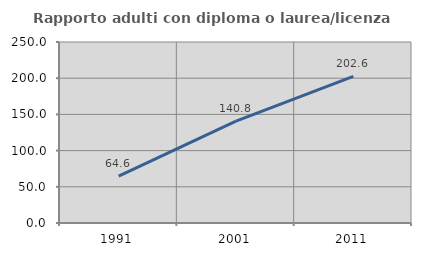
| Category | Rapporto adulti con diploma o laurea/licenza media  |
|---|---|
| 1991.0 | 64.641 |
| 2001.0 | 140.828 |
| 2011.0 | 202.597 |